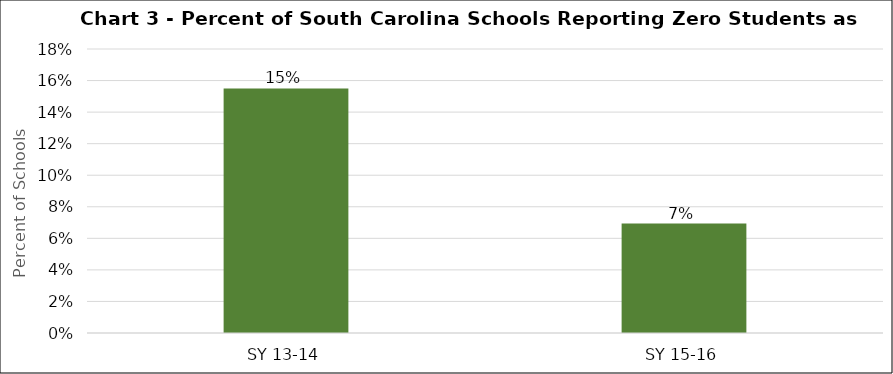
| Category | Series 0 |
|---|---|
| SY 13-14 | 0.155 |
| SY 15-16 | 0.069 |